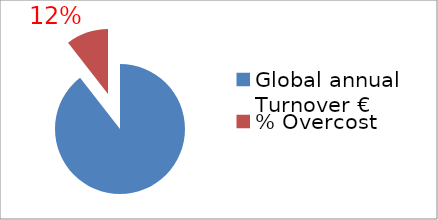
| Category | Series 0 |
|---|---|
| Global annual Turnover € | 1 |
| % Overcost  | 0.118 |